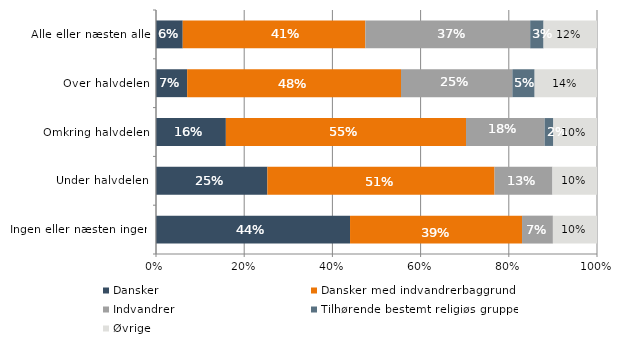
| Category | Dansker | Dansker med indvandrerbaggrund | Indvandrer | Tilhørende bestemt religiøs gruppe | Øvrige |
|---|---|---|---|---|---|
| Ingen eller næsten ingen | 0.44 | 0.39 | 0.07 | 0 | 0.1 |
| Under halvdelen | 0.25 | 0.51 | 0.13 | 0 | 0.1 |
| Omkring halvdelen | 0.16 | 0.55 | 0.18 | 0.02 | 0.1 |
| Over halvdelen | 0.07 | 0.48 | 0.25 | 0.05 | 0.14 |
| Alle eller næsten alle | 0.06 | 0.41 | 0.37 | 0.03 | 0.12 |